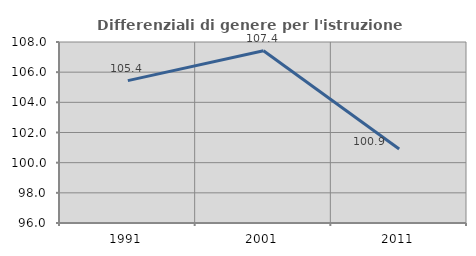
| Category | Differenziali di genere per l'istruzione superiore |
|---|---|
| 1991.0 | 105.438 |
| 2001.0 | 107.42 |
| 2011.0 | 100.911 |